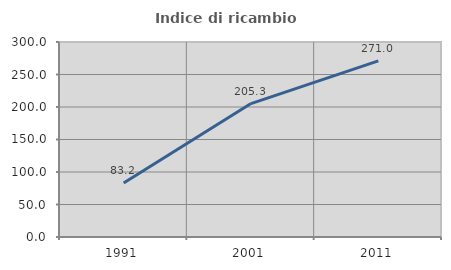
| Category | Indice di ricambio occupazionale  |
|---|---|
| 1991.0 | 83.158 |
| 2001.0 | 205.263 |
| 2011.0 | 270.968 |